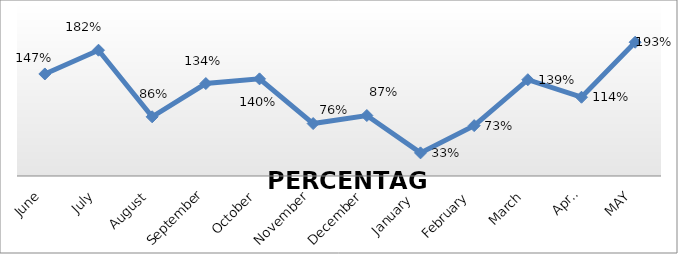
| Category | PERCENTAGE |
|---|---|
| June | 1.475 |
| July | 1.818 |
| August | 0.855 |
| September | 1.336 |
| October | 1.404 |
| November | 0.758 |
| December | 0.874 |
| January  | 0.334 |
| February | 0.728 |
| March | 1.392 |
| April | 1.138 |
| MAY | 1.933 |